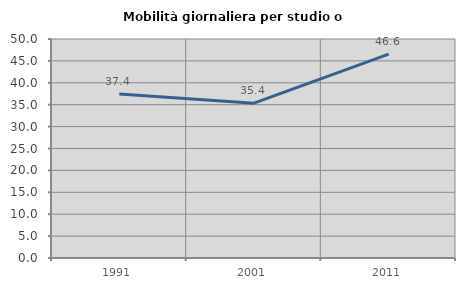
| Category | Mobilità giornaliera per studio o lavoro |
|---|---|
| 1991.0 | 37.439 |
| 2001.0 | 35.354 |
| 2011.0 | 46.555 |